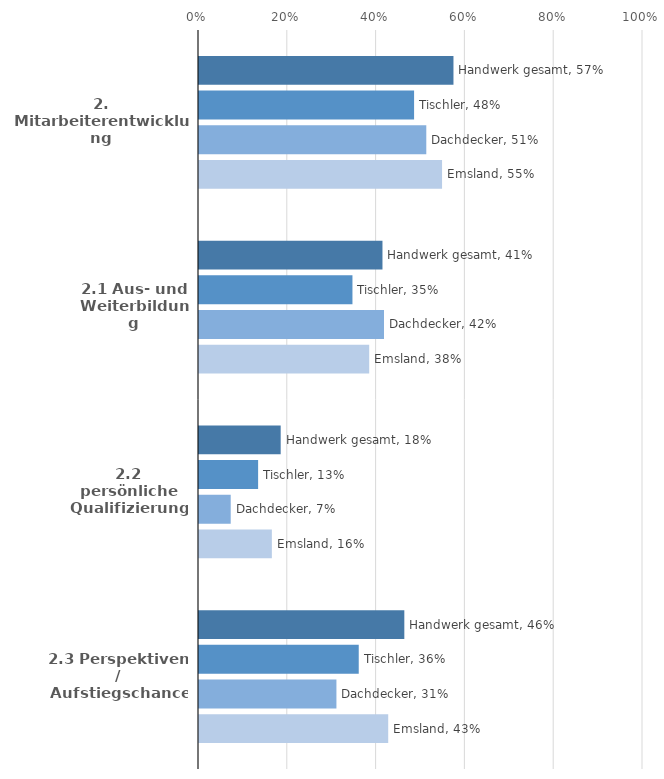
| Category | Handwerk gesamt | Tischler | Dachdecker | Emsland |
|---|---|---|---|---|
| 2. Mitarbeiterentwicklung | 0.573 | 0.484 | 0.512 | 0.547 |
| 2.1 Aus- und Weiterbildung | 0.413 | 0.346 | 0.417 | 0.383 |
| 2.2 persönliche Qualifizierung / Fortbildung | 0.184 | 0.133 | 0.071 | 0.164 |
| 2.3 Perspektiven / Aufstiegschancen | 0.462 | 0.36 | 0.31 | 0.426 |